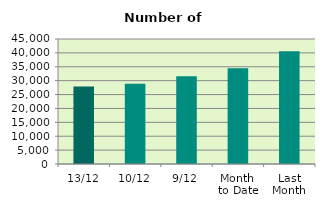
| Category | Series 0 |
|---|---|
| 13/12 | 27924 |
| 10/12 | 28908 |
| 9/12 | 31608 |
| Month 
to Date | 34437.778 |
| Last
Month | 40546.091 |